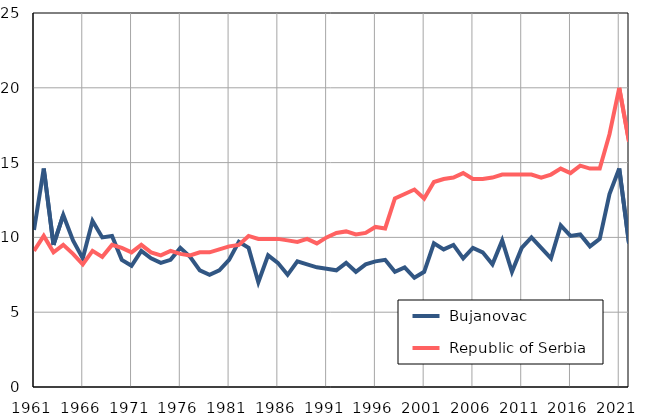
| Category |  Bujanovac |  Republic of Serbia |
|---|---|---|
| 1961.0 | 10.5 | 9.1 |
| 1962.0 | 14.6 | 10.1 |
| 1963.0 | 9.5 | 9 |
| 1964.0 | 11.5 | 9.5 |
| 1965.0 | 9.8 | 8.9 |
| 1966.0 | 8.6 | 8.2 |
| 1967.0 | 11.1 | 9.1 |
| 1968.0 | 10 | 8.7 |
| 1969.0 | 10.1 | 9.5 |
| 1970.0 | 8.5 | 9.3 |
| 1971.0 | 8.1 | 9 |
| 1972.0 | 9.1 | 9.5 |
| 1973.0 | 8.6 | 9 |
| 1974.0 | 8.3 | 8.8 |
| 1975.0 | 8.5 | 9.1 |
| 1976.0 | 9.3 | 8.9 |
| 1977.0 | 8.7 | 8.8 |
| 1978.0 | 7.8 | 9 |
| 1979.0 | 7.5 | 9 |
| 1980.0 | 7.8 | 9.2 |
| 1981.0 | 8.5 | 9.4 |
| 1982.0 | 9.7 | 9.5 |
| 1983.0 | 9.3 | 10.1 |
| 1984.0 | 7 | 9.9 |
| 1985.0 | 8.8 | 9.9 |
| 1986.0 | 8.3 | 9.9 |
| 1987.0 | 7.5 | 9.8 |
| 1988.0 | 8.4 | 9.7 |
| 1989.0 | 8.2 | 9.9 |
| 1990.0 | 8 | 9.6 |
| 1991.0 | 7.9 | 10 |
| 1992.0 | 7.8 | 10.3 |
| 1993.0 | 8.3 | 10.4 |
| 1994.0 | 7.7 | 10.2 |
| 1995.0 | 8.2 | 10.3 |
| 1996.0 | 8.4 | 10.7 |
| 1997.0 | 8.5 | 10.6 |
| 1998.0 | 7.7 | 12.6 |
| 1999.0 | 8 | 12.9 |
| 2000.0 | 7.3 | 13.2 |
| 2001.0 | 7.7 | 12.6 |
| 2002.0 | 9.6 | 13.7 |
| 2003.0 | 9.2 | 13.9 |
| 2004.0 | 9.5 | 14 |
| 2005.0 | 8.6 | 14.3 |
| 2006.0 | 9.3 | 13.9 |
| 2007.0 | 9 | 13.9 |
| 2008.0 | 8.2 | 14 |
| 2009.0 | 9.8 | 14.2 |
| 2010.0 | 7.7 | 14.2 |
| 2011.0 | 9.3 | 14.2 |
| 2012.0 | 10 | 14.2 |
| 2013.0 | 9.3 | 14 |
| 2014.0 | 8.6 | 14.2 |
| 2015.0 | 10.8 | 14.6 |
| 2016.0 | 10.1 | 14.3 |
| 2017.0 | 10.2 | 14.8 |
| 2018.0 | 9.4 | 14.6 |
| 2019.0 | 9.9 | 14.6 |
| 2020.0 | 12.9 | 16.9 |
| 2021.0 | 14.6 | 20 |
| 2022.0 | 9.6 | 16.4 |